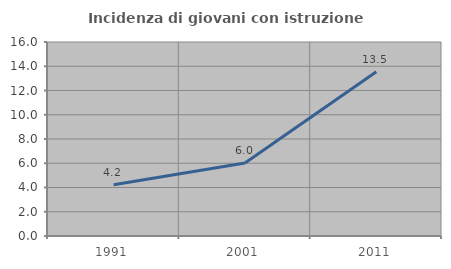
| Category | Incidenza di giovani con istruzione universitaria |
|---|---|
| 1991.0 | 4.219 |
| 2001.0 | 6.029 |
| 2011.0 | 13.548 |